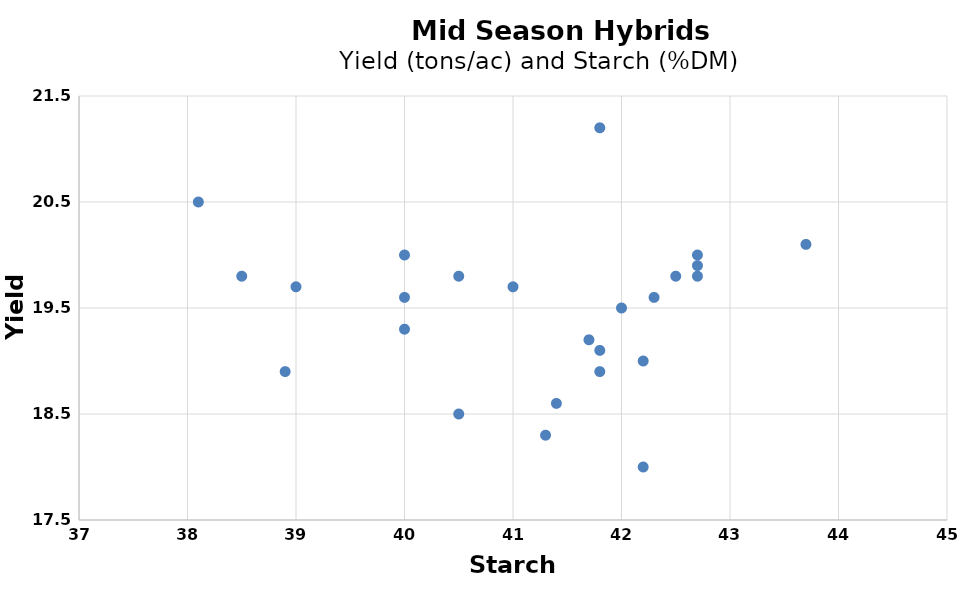
| Category | Series 0 |
|---|---|
| 41.8 | 19.1 |
| 42.2 | 18 |
| 42.7 | 19.8 |
| 42.2 | 19 |
| 41.7 | 19.2 |
| 41.8 | 18.9 |
| 38.9 | 18.9 |
| 43.7 | 20.1 |
| 42.3 | 19.6 |
| 38.1 | 20.5 |
| 41.8 | 21.2 |
| 40.0 | 19.3 |
| 40.0 | 20 |
| 40.0 | 19.6 |
| 41.0 | 19.7 |
| 40.5 | 19.8 |
| 41.4 | 18.6 |
| 40.5 | 18.5 |
| 38.5 | 19.8 |
| 42.5 | 19.8 |
| 42.0 | 19.5 |
| 39.0 | 19.7 |
| 42.7 | 19.9 |
| 42.7 | 20 |
| 41.3 | 18.3 |